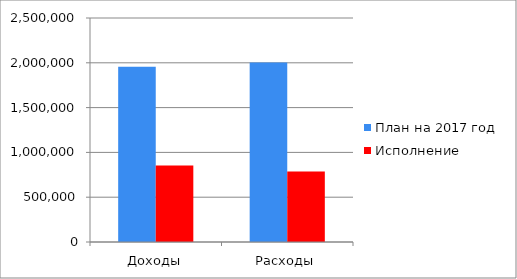
| Category | План на 2017 год | Исполнение |
|---|---|---|
| Доходы | 1956469 | 855072 |
| Расходы | 2003028 | 787254 |